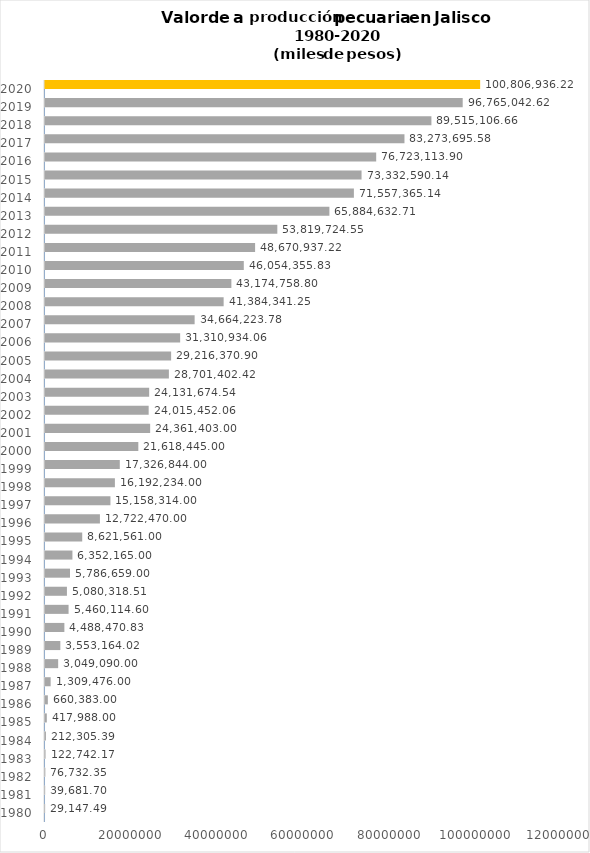
| Category | Año | Valor de la Producción (miles de pesos) |
|---|---|---|
| 1980.0 | 1980 | 29147.49 |
| 1981.0 | 1981 | 39681.7 |
| 1982.0 | 1982 | 76732.35 |
| 1983.0 | 1983 | 122742.17 |
| 1984.0 | 1984 | 212305.393 |
| 1985.0 | 1985 | 417988 |
| 1986.0 | 1986 | 660383 |
| 1987.0 | 1987 | 1309476 |
| 1988.0 | 1988 | 3049090 |
| 1989.0 | 1989 | 3553164.016 |
| 1990.0 | 1990 | 4488470.832 |
| 1991.0 | 1991 | 5460114.601 |
| 1992.0 | 1992 | 5080318.505 |
| 1993.0 | 1993 | 5786659 |
| 1994.0 | 1994 | 6352165 |
| 1995.0 | 1995 | 8621561 |
| 1996.0 | 1996 | 12722470 |
| 1997.0 | 1997 | 15158314 |
| 1998.0 | 1998 | 16192234 |
| 1999.0 | 1999 | 17326844 |
| 2000.0 | 2000 | 21618445 |
| 2001.0 | 2001 | 24361403 |
| 2002.0 | 2002 | 24015452.058 |
| 2003.0 | 2003 | 24131674.542 |
| 2004.0 | 2004 | 28701402.419 |
| 2005.0 | 2005 | 29216370.902 |
| 2006.0 | 2006 | 31310934.062 |
| 2007.0 | 2007 | 34664223.778 |
| 2008.0 | 2008 | 41384341.245 |
| 2009.0 | 2009 | 43174758.8 |
| 2010.0 | 2010 | 46054355.827 |
| 2011.0 | 2011 | 48670937.217 |
| 2012.0 | 2012 | 53819724.545 |
| 2013.0 | 2013 | 65884632.713 |
| 2014.0 | 2014 | 71557365.143 |
| 2015.0 | 2015 | 73332590.137 |
| 2016.0 | 2016 | 76723113.902 |
| 2017.0 | 2017 | 83273695.583 |
| 2018.0 | 2018 | 89515106.66 |
| 2019.0 | 2019 | 96765042.624 |
| 2020.0 | 2020 | 100806936.215 |